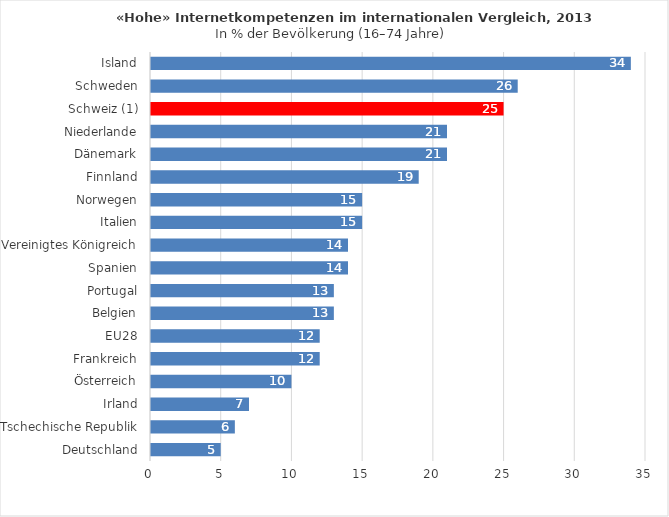
| Category | Hat bereits fünf oder sechs der genannten Aktivitäten durchgeführt |
|---|---|
| Deutschland | 5 |
| Tschechische Republik | 6 |
| Irland | 7 |
| Österreich | 10 |
| Frankreich | 12 |
| EU28 | 12 |
| Belgien | 13 |
| Portugal | 13 |
| Spanien | 14 |
| Vereinigtes Königreich | 14 |
| Italien | 15 |
| Norwegen | 15 |
| Finnland | 19 |
| Dänemark | 21 |
| Niederlande | 21 |
| Schweiz (1) | 25 |
| Schweden | 26 |
| Island | 34 |